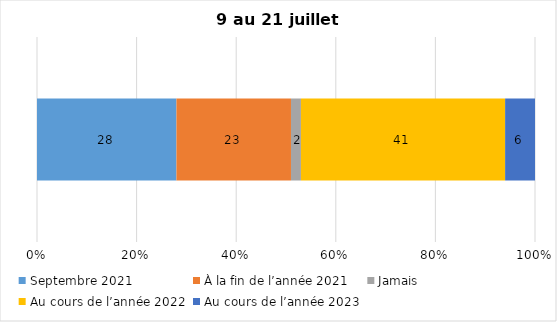
| Category | Septembre 2021 | À la fin de l’année 2021 | Jamais | Au cours de l’année 2022 | Au cours de l’année 2023 |
|---|---|---|---|---|---|
| 0 | 28 | 23 | 2 | 41 | 6 |